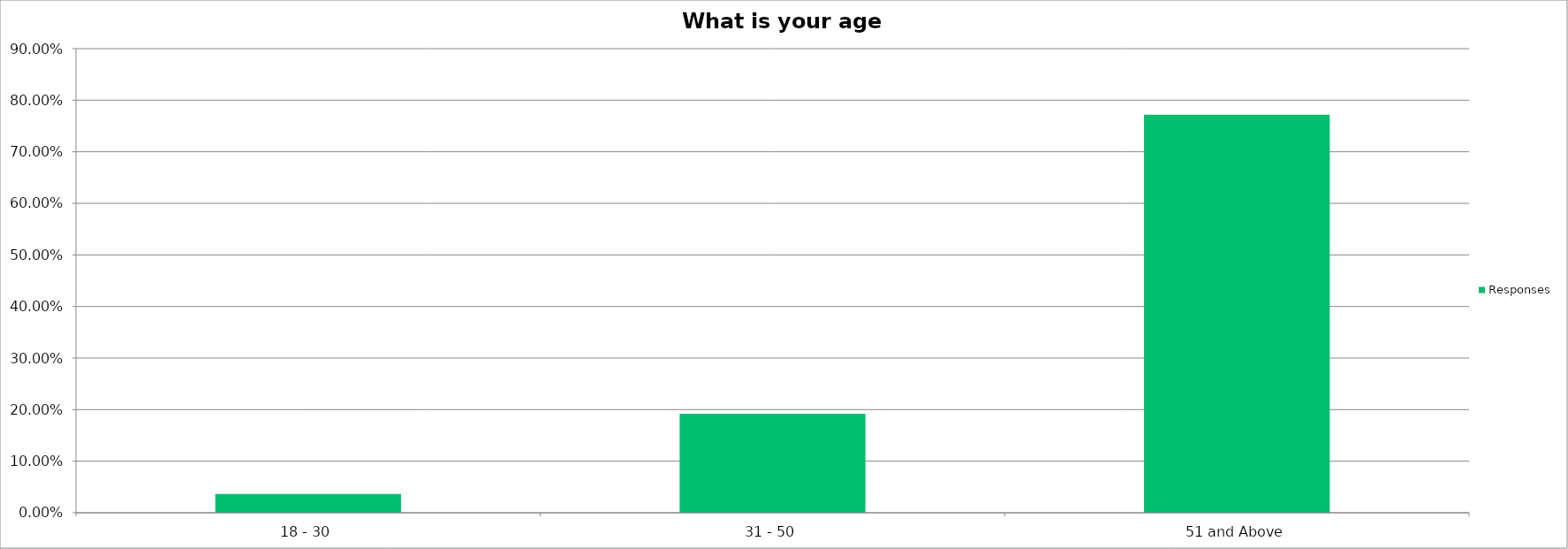
| Category | Responses |
|---|---|
| 18 - 30 | 0.036 |
| 31 - 50 | 0.192 |
| 51 and Above | 0.772 |